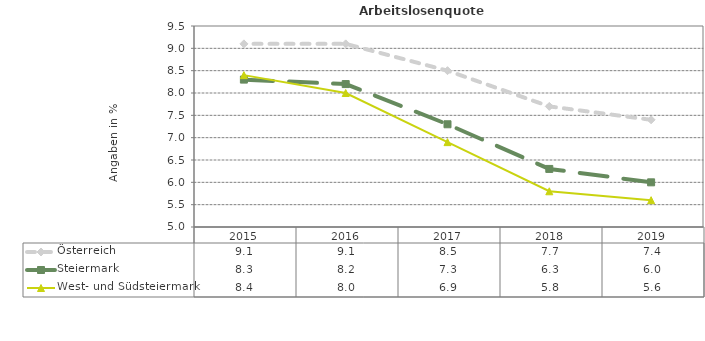
| Category | Österreich | Steiermark | West- und Südsteiermark |
|---|---|---|---|
| 2019.0 | 7.4 | 6 | 5.6 |
| 2018.0 | 7.7 | 6.3 | 5.8 |
| 2017.0 | 8.5 | 7.3 | 6.9 |
| 2016.0 | 9.1 | 8.2 | 8 |
| 2015.0 | 9.1 | 8.3 | 8.4 |